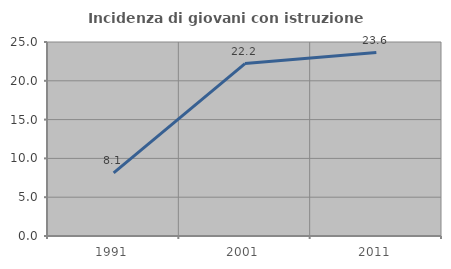
| Category | Incidenza di giovani con istruzione universitaria |
|---|---|
| 1991.0 | 8.14 |
| 2001.0 | 22.222 |
| 2011.0 | 23.636 |